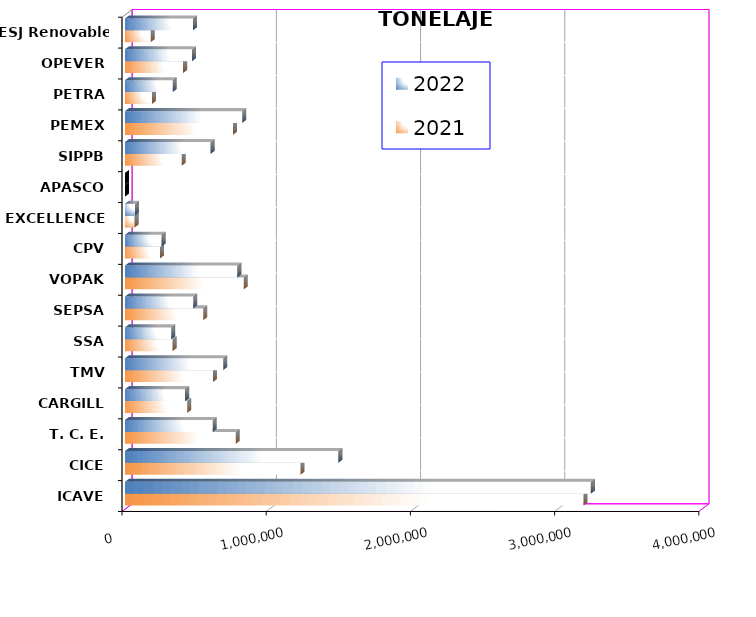
| Category | 2021 | 2022 |
|---|---|---|
| ICAVE | 3179680.582 | 3230375.36 |
| CICE | 1217549.107 | 1479574.48 |
| T. C. E. | 768598.867 | 608229.44 |
| CARGILL | 432110.4 | 417114.79 |
| TMV | 610072.17 | 680691.47 |
| SSA | 330174.121 | 320164.824 |
| SEPSA | 542335.07 | 473139.57 |
| VOPAK | 823701.015 | 779315.355 |
| CPV | 242691.66 | 253916.63 |
| EXCELLENCE | 66728.155 | 68832.577 |
| APASCO | 0 | 0 |
| SIPPB | 393576.135 | 593905.975 |
| PEMEX | 748754.148 | 812666.895 |
| PETRA | 187177.66 | 330726.809 |
| OPEVER | 402863.13 | 465157.172 |
| ESJ Renovable III | 178153.289 | 471640.004 |